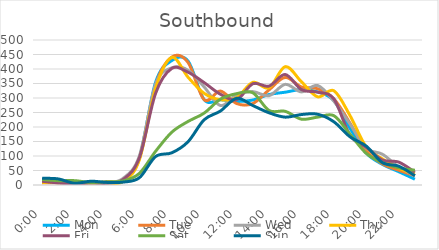
| Category | Mon | Tue | Wed | Thu | Fri | Sat | Sun |
|---|---|---|---|---|---|---|---|
| 0.0 | 15 | 8 | 20 | 8 | 13 | 19 | 23 |
| 0.041667 | 13 | 7 | 12 | 10 | 7 | 15 | 21 |
| 0.083333 | 3 | 2 | 4 | 3 | 3 | 15 | 6 |
| 0.125 | 4 | 5 | 2 | 7 | 7 | 9 | 13 |
| 0.166667 | 7 | 11 | 7 | 7 | 6 | 11 | 9 |
| 0.208333 | 15 | 18 | 23 | 12 | 19 | 14 | 10 |
| 0.25 | 94 | 91 | 100 | 87 | 94 | 40 | 25 |
| 0.291667 | 354 | 345 | 347 | 333 | 316 | 116 | 98 |
| 0.333333 | 429 | 441 | 404 | 440 | 402 | 182 | 111 |
| 0.375 | 428 | 423 | 396 | 372 | 389 | 219 | 149 |
| 0.416667 | 294 | 294 | 338 | 316 | 353 | 248 | 225 |
| 0.458333 | 294 | 324 | 274 | 294 | 313 | 296 | 255 |
| 0.5 | 288 | 281 | 311 | 301 | 294 | 315 | 299 |
| 0.541667 | 293 | 281 | 322 | 354 | 349 | 318 | 274 |
| 0.5833333333333334 | 312 | 328 | 308 | 335 | 341 | 257 | 249 |
| 0.625 | 320 | 371 | 347 | 408 | 381 | 254 | 234 |
| 0.666667 | 329 | 338 | 321 | 356 | 329 | 227 | 243 |
| 0.708333 | 321 | 332 | 343 | 304 | 320 | 234 | 244 |
| 0.75 | 291 | 297 | 289 | 325 | 297 | 239 | 218 |
| 0.791667 | 195 | 213 | 210 | 239 | 171 | 175 | 166 |
| 0.833333 | 110 | 118 | 127 | 131 | 130 | 109 | 134 |
| 0.875 | 71 | 73 | 106 | 90 | 86 | 77 | 77 |
| 0.916667 | 46 | 51 | 62 | 58 | 79 | 59 | 65 |
| 0.958333 | 20 | 32 | 32 | 38 | 44 | 51 | 32 |